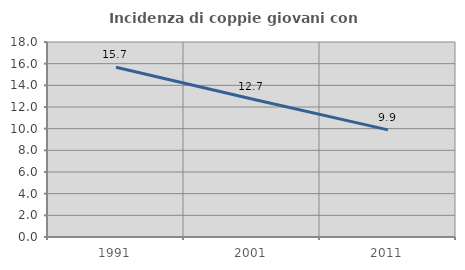
| Category | Incidenza di coppie giovani con figli |
|---|---|
| 1991.0 | 15.663 |
| 2001.0 | 12.736 |
| 2011.0 | 9.889 |